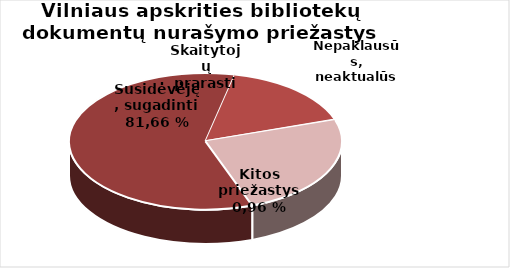
| Category | Series 0 |
|---|---|
| Susidėvėję, | 44770 |
| Nepaklausūs, | 12422 |
| Skaitytojų  | 81 |
| Kt. | 18586 |